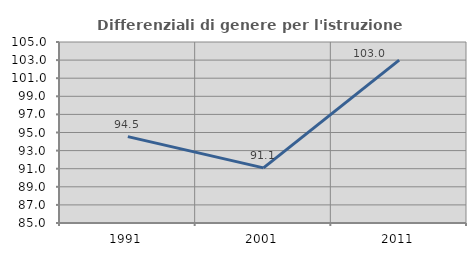
| Category | Differenziali di genere per l'istruzione superiore |
|---|---|
| 1991.0 | 94.542 |
| 2001.0 | 91.088 |
| 2011.0 | 102.99 |